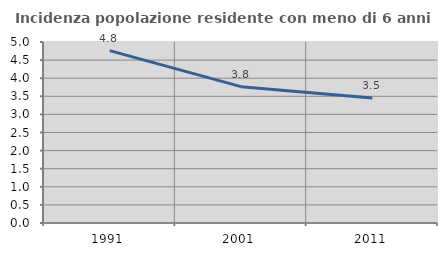
| Category | Incidenza popolazione residente con meno di 6 anni |
|---|---|
| 1991.0 | 4.762 |
| 2001.0 | 3.766 |
| 2011.0 | 3.451 |